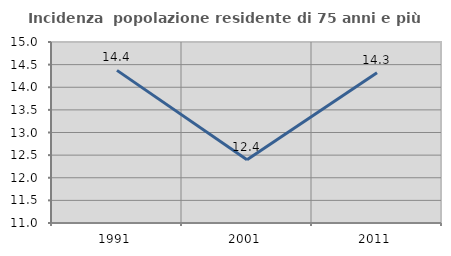
| Category | Incidenza  popolazione residente di 75 anni e più |
|---|---|
| 1991.0 | 14.373 |
| 2001.0 | 12.399 |
| 2011.0 | 14.32 |